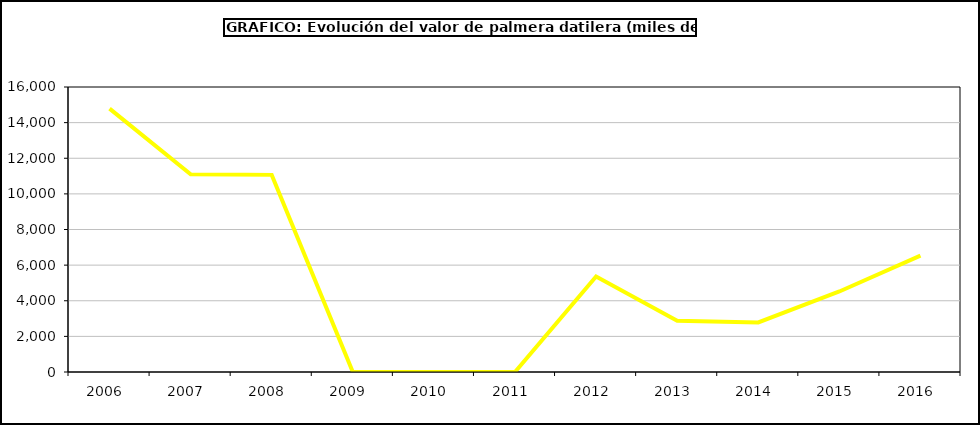
| Category | valor kiwi |
|---|---|
| 2006.0 | 14786.24 |
| 2007.0 | 11098.832 |
| 2008.0 | 11066.726 |
| 2009.0 | 0 |
| 2010.0 | 0 |
| 2011.0 | 0 |
| 2012.0 | 5362.2 |
| 2013.0 | 2872 |
| 2014.0 | 2781 |
| 2015.0 | 4520 |
| 2016.0 | 6537 |